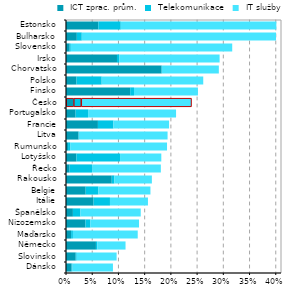
| Category |  ICT zprac. prům. |  Telekomunikace |  IT služby |
|---|---|---|---|
| Dánsko | 0.011 | 0.002 | 0.077 |
| Slovinsko | 0.019 | 0.002 | 0.076 |
| Německo | 0.057 | 0.002 | 0.054 |
| Maďarsko | 0.01 | 0.003 | 0.124 |
| Nizozemsko | 0.037 | 0.009 | 0.093 |
| Španělsko | 0.013 | 0.014 | 0.115 |
| Itálie | 0.053 | 0.031 | 0.072 |
| Belgie | 0.038 | 0.024 | 0.099 |
| Rakousko | 0.087 | 0.005 | 0.072 |
| Řecko | 0.007 | 0.043 | 0.131 |
| Lotyšsko | 0.02 | 0.083 | 0.079 |
| Rumunsko | 0.004 | 0.004 | 0.185 |
| Litva | 0.024 | 0 | 0.169 |
| Francie | 0.061 | 0.03 | 0.106 |
| Portugalsko | 0.018 | 0.024 | 0.168 |
| Česko | 0.014 | 0.014 | 0.21 |
| Finsko | 0.122 | 0.007 | 0.122 |
| Polsko | 0.02 | 0.048 | 0.194 |
| Chorvatsko | 0.182 | 0.001 | 0.109 |
| Irsko | 0.097 | 0.004 | 0.191 |
| Slovensko | 0.007 | 0.002 | 0.308 |
| Bulharsko | 0.021 | 0.009 | 0.37 |
| Estonsko | 0.062 | 0.043 | 0.297 |